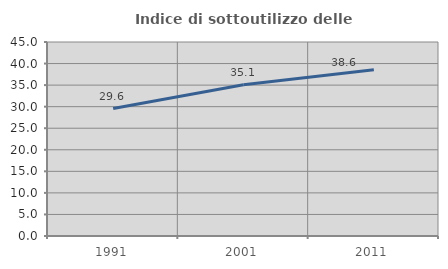
| Category | Indice di sottoutilizzo delle abitazioni  |
|---|---|
| 1991.0 | 29.563 |
| 2001.0 | 35.079 |
| 2011.0 | 38.56 |